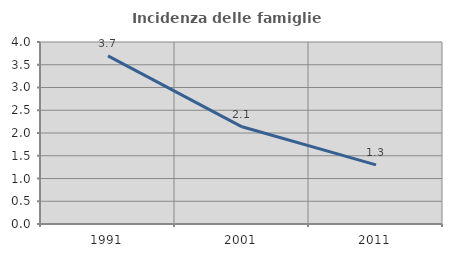
| Category | Incidenza delle famiglie numerose |
|---|---|
| 1991.0 | 3.696 |
| 2001.0 | 2.136 |
| 2011.0 | 1.299 |